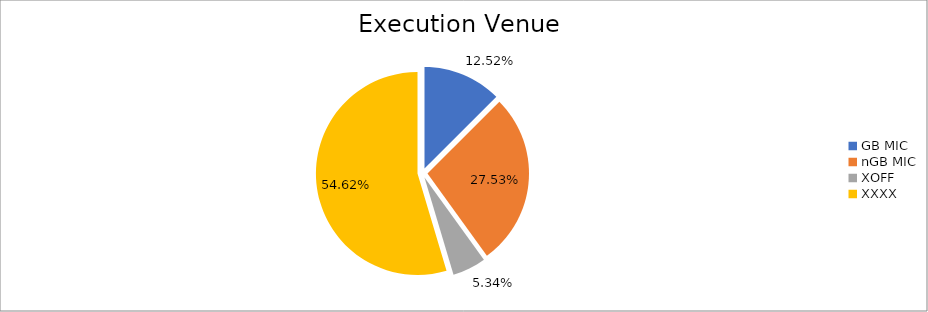
| Category | Series 0 |
|---|---|
| GB MIC | 1205539.15 |
| nGB MIC | 2651057.844 |
| XOFF | 513985.999 |
| XXXX | 5259785.047 |